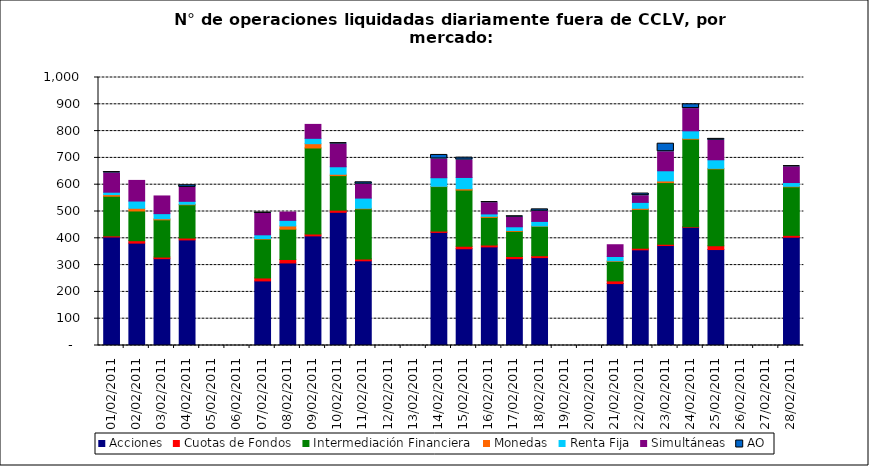
| Category | Acciones | Cuotas de Fondos | Intermediación Financiera | Monedas | Renta Fija | Simultáneas | AO |
|---|---|---|---|---|---|---|---|
| 01/02/2011 | 405 | 4 | 148 | 6 | 9 | 72 | 3 |
| 02/02/2011 | 382 | 9 | 111 | 10 | 27 | 77 | 0 |
| 03/02/2011 | 324 | 6 | 139 | 4 | 19 | 66 | 0 |
| 04/02/2011 | 394 | 7 | 124 | 2 | 11 | 52 | 8 |
| 07/02/2011 | 241 | 11 | 145 | 2 | 14 | 80 | 3 |
| 08/02/2011 | 308 | 13 | 113 | 12 | 21 | 31 | 0 |
| 09/02/2011 | 409 | 7 | 321 | 16 | 20 | 52 | 0 |
| 10/02/2011 | 497 | 8 | 129 | 5 | 28 | 85 | 3 |
| 11/02/2011 | 316 | 7 | 187 | 2 | 38 | 52 | 7 |
| 14/02/2011 | 422 | 5 | 166 | 1 | 32 | 70 | 15 |
| 15/02/2011 | 361 | 9 | 210 | 5 | 42 | 65 | 9 |
| 16/02/2011 | 368 | 7 | 103 | 4 | 9 | 42 | 2 |
| 17/02/2011 | 324 | 8 | 94 | 3 | 14 | 36 | 3 |
| 18/02/2011 | 328 | 7 | 110 | 1 | 17 | 38 | 7 |
| 21/02/2011 | 231 | 10 | 73 | 2 | 16 | 44 | 0 |
| 22/02/2011 | 357 | 6 | 145 | 4 | 22 | 25 | 8 |
| 23/02/2011 | 373 | 5 | 230 | 6 | 38 | 71 | 30 |
| 24/02/2011 | 441 | 2 | 327 | 3 | 28 | 83 | 16 |
| 25/02/2011 | 358 | 14 | 287 | 2 | 32 | 73 | 5 |
| 28/02/2011 | 404 | 7 | 181 | 2 | 14 | 59 | 2 |